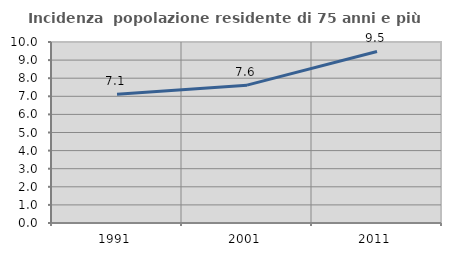
| Category | Incidenza  popolazione residente di 75 anni e più |
|---|---|
| 1991.0 | 7.117 |
| 2001.0 | 7.617 |
| 2011.0 | 9.476 |